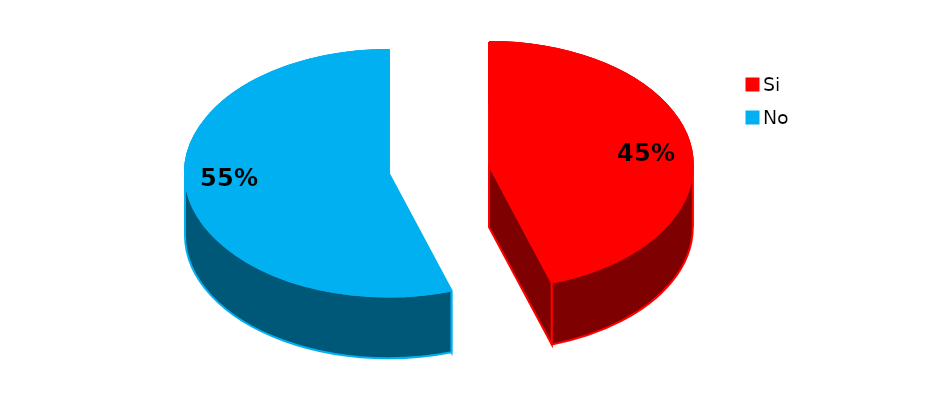
| Category | Series 0 |
|---|---|
| Si | 140 |
| No | 171 |